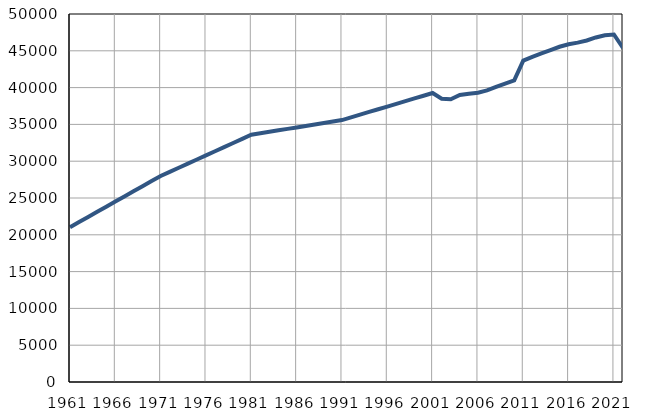
| Category | Број
становника |
|---|---|
| 1961.0 | 21039 |
| 1962.0 | 21734 |
| 1963.0 | 22429 |
| 1964.0 | 23125 |
| 1965.0 | 23820 |
| 1966.0 | 24515 |
| 1967.0 | 25210 |
| 1968.0 | 25905 |
| 1969.0 | 26602 |
| 1970.0 | 27296 |
| 1971.0 | 27991 |
| 1972.0 | 28551 |
| 1973.0 | 29111 |
| 1974.0 | 29672 |
| 1975.0 | 30232 |
| 1976.0 | 30792 |
| 1977.0 | 31352 |
| 1978.0 | 31911 |
| 1979.0 | 32473 |
| 1980.0 | 33033 |
| 1981.0 | 33593 |
| 1982.0 | 33793 |
| 1983.0 | 33993 |
| 1984.0 | 34192 |
| 1985.0 | 34391 |
| 1986.0 | 34592 |
| 1987.0 | 34792 |
| 1988.0 | 34992 |
| 1989.0 | 35191 |
| 1990.0 | 35391 |
| 1991.0 | 35591 |
| 1992.0 | 35958 |
| 1993.0 | 36325 |
| 1994.0 | 36692 |
| 1995.0 | 37059 |
| 1996.0 | 37426 |
| 1997.0 | 37792 |
| 1998.0 | 38159 |
| 1999.0 | 38526 |
| 2000.0 | 38893 |
| 2001.0 | 39260 |
| 2002.0 | 38487 |
| 2003.0 | 38422 |
| 2004.0 | 39001 |
| 2005.0 | 39160 |
| 2006.0 | 39306 |
| 2007.0 | 39615 |
| 2008.0 | 40095 |
| 2009.0 | 40554 |
| 2010.0 | 40974 |
| 2011.0 | 43664 |
| 2012.0 | 44180 |
| 2013.0 | 44649 |
| 2014.0 | 45100 |
| 2015.0 | 45550 |
| 2016.0 | 45887 |
| 2017.0 | 46115 |
| 2018.0 | 46406 |
| 2019.0 | 46815 |
| 2020.0 | 47116 |
| 2021.0 | 47218 |
| 2022.0 | 45386 |